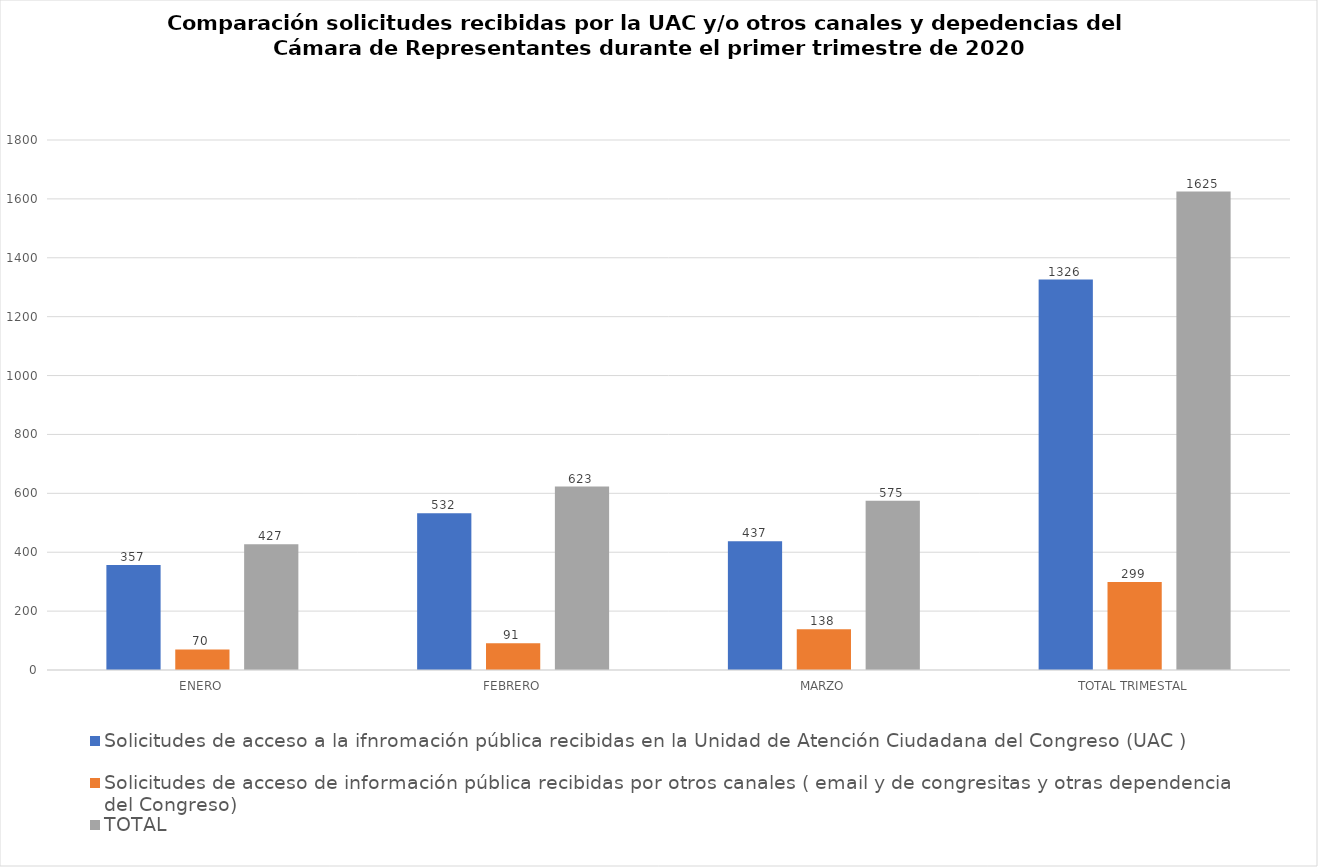
| Category | Solicitudes de acceso a la ifnromación pública recibidas en la Unidad de Atención Ciudadana del Congreso (UAC ) | Solicitudes de acceso de información pública recibidas por otros canales ( email y de congresitas y otras dependencias del Congreso) | TOTAL |
|---|---|---|---|
| ENERO | 357 | 70 | 427 |
| FEBRERO | 532 | 91 | 623 |
| MARZO | 437 | 138 | 575 |
| TOTAL TRIMESTAL | 1326 | 299 | 1625 |